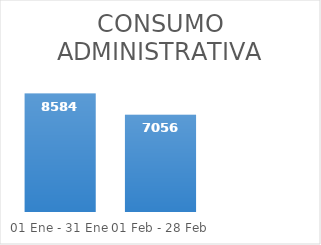
| Category | Series 0 |
|---|---|
| 01 Ene - 31 Ene | 8584 |
| 01 Feb - 28 Feb | 7056 |